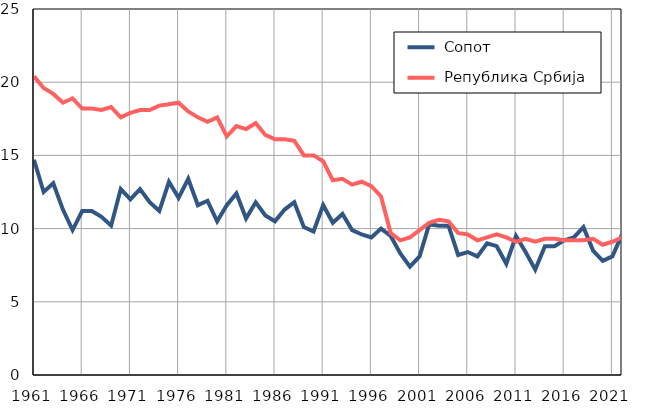
| Category |  Сопот |  Република Србија |
|---|---|---|
| 1961.0 | 14.7 | 20.4 |
| 1962.0 | 12.5 | 19.6 |
| 1963.0 | 13.1 | 19.2 |
| 1964.0 | 11.3 | 18.6 |
| 1965.0 | 9.9 | 18.9 |
| 1966.0 | 11.2 | 18.2 |
| 1967.0 | 11.2 | 18.2 |
| 1968.0 | 10.8 | 18.1 |
| 1969.0 | 10.2 | 18.3 |
| 1970.0 | 12.7 | 17.6 |
| 1971.0 | 12 | 17.9 |
| 1972.0 | 12.7 | 18.1 |
| 1973.0 | 11.8 | 18.1 |
| 1974.0 | 11.2 | 18.4 |
| 1975.0 | 13.2 | 18.5 |
| 1976.0 | 12.1 | 18.6 |
| 1977.0 | 13.4 | 18 |
| 1978.0 | 11.6 | 17.6 |
| 1979.0 | 11.9 | 17.3 |
| 1980.0 | 10.5 | 17.6 |
| 1981.0 | 11.6 | 16.3 |
| 1982.0 | 12.4 | 17 |
| 1983.0 | 10.7 | 16.8 |
| 1984.0 | 11.8 | 17.2 |
| 1985.0 | 10.9 | 16.4 |
| 1986.0 | 10.5 | 16.1 |
| 1987.0 | 11.3 | 16.1 |
| 1988.0 | 11.8 | 16 |
| 1989.0 | 10.1 | 15 |
| 1990.0 | 9.8 | 15 |
| 1991.0 | 11.6 | 14.6 |
| 1992.0 | 10.4 | 13.3 |
| 1993.0 | 11 | 13.4 |
| 1994.0 | 9.9 | 13 |
| 1995.0 | 9.6 | 13.2 |
| 1996.0 | 9.4 | 12.9 |
| 1997.0 | 10 | 12.2 |
| 1998.0 | 9.5 | 9.7 |
| 1999.0 | 8.3 | 9.2 |
| 2000.0 | 7.4 | 9.4 |
| 2001.0 | 8.1 | 9.9 |
| 2002.0 | 10.3 | 10.4 |
| 2003.0 | 10.2 | 10.6 |
| 2004.0 | 10.2 | 10.5 |
| 2005.0 | 8.2 | 9.7 |
| 2006.0 | 8.4 | 9.6 |
| 2007.0 | 8.1 | 9.2 |
| 2008.0 | 9 | 9.4 |
| 2009.0 | 8.8 | 9.6 |
| 2010.0 | 7.6 | 9.4 |
| 2011.0 | 9.5 | 9.1 |
| 2012.0 | 8.4 | 9.3 |
| 2013.0 | 7.2 | 9.1 |
| 2014.0 | 8.8 | 9.3 |
| 2015.0 | 8.8 | 9.3 |
| 2016.0 | 9.2 | 9.2 |
| 2017.0 | 9.4 | 9.2 |
| 2018.0 | 10.1 | 9.2 |
| 2019.0 | 8.5 | 9.3 |
| 2020.0 | 7.8 | 8.9 |
| 2021.0 | 8.1 | 9.1 |
| 2022.0 | 9.6 | 9.4 |